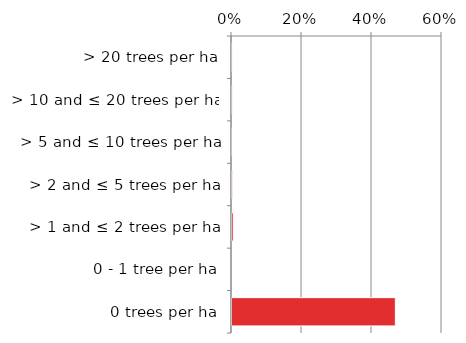
| Category | Native |
|---|---|
| 0 trees per ha | 0.467 |
| 0 - 1 tree per ha | 0 |
| > 1 and ≤ 2 trees per ha | 0.004 |
| > 2 and ≤ 5 trees per ha | 0.002 |
| > 5 and ≤ 10 trees per ha | 0.001 |
| > 10 and ≤ 20 trees per ha | 0.001 |
| > 20 trees per ha | 0 |